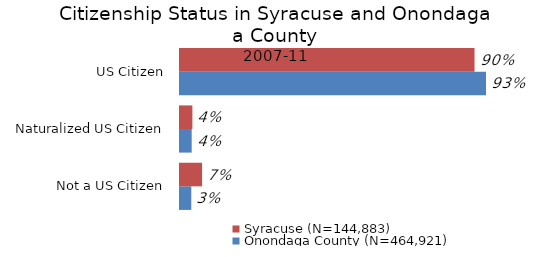
| Category | Onondaga County (N=464,921) | Syracuse (N=144,883) |
|---|---|---|
| Not a US Citizen | 0.034 | 0.067 |
| Naturalized US Citizen | 0.036 | 0.038 |
| US Citizen | 0.93 | 0.895 |